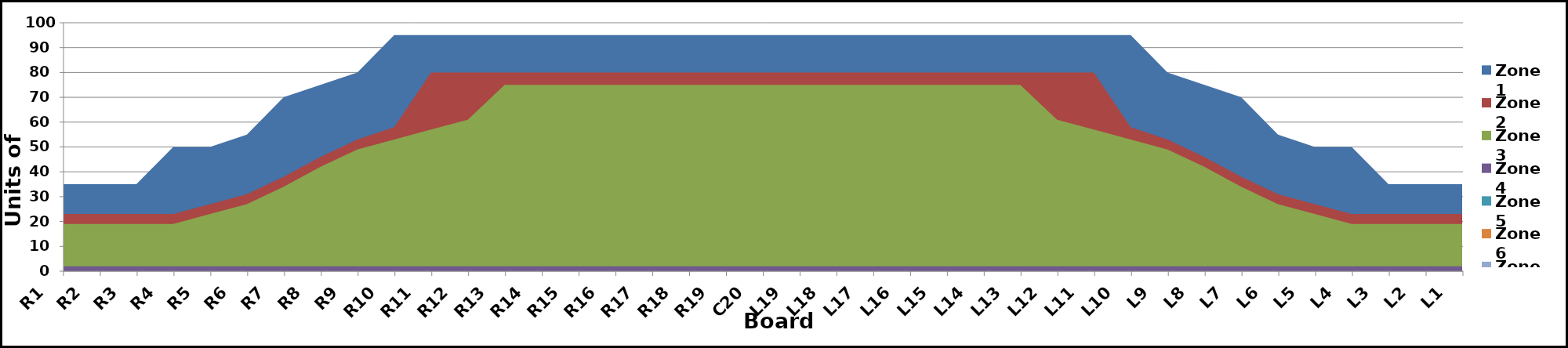
| Category | Zone 1 | Zone 2 | Zone 3 | Zone 4 | Zone 5 | Zone 6 | Zone 7 | Zone 8 |
|---|---|---|---|---|---|---|---|---|
| L1 | 35 | 23 | 19 | 2 | 0 |  |  |  |
| L2 | 35 | 23 | 19 | 2 | 0 |  |  |  |
| L3 | 35 | 23 | 19 | 2 | 0 |  |  |  |
| L4 | 50 | 23 | 19 | 2 | 0 |  |  |  |
| L5 | 50 | 27 | 23 | 2 | 0 |  |  |  |
| L6 | 55 | 31 | 27 | 2 | 0 |  |  |  |
| L7 | 70 | 38 | 34 | 2 | 0 |  |  |  |
| L8 | 75 | 46 | 42 | 2 | 0 |  |  |  |
| L9 | 80 | 53 | 49 | 2 | 0 |  |  |  |
| L10 | 95 | 58 | 53 | 2 | 0 |  |  |  |
| L11 | 95 | 80 | 57 | 2 | 0 |  |  |  |
| L12 | 95 | 80 | 61 | 2 | 0 |  |  |  |
| L13 | 95 | 80 | 75 | 2 | 0 |  |  |  |
| L14 | 95 | 80 | 75 | 2 | 0 |  |  |  |
| L15 | 95 | 80 | 75 | 2 | 0 |  |  |  |
| L16 | 95 | 80 | 75 | 2 | 0 |  |  |  |
| L17 | 95 | 80 | 75 | 2 | 0 |  |  |  |
| L18 | 95 | 80 | 75 | 2 | 0 |  |  |  |
| L19 | 95 | 80 | 75 | 2 | 0 |  |  |  |
| C20 | 95 | 80 | 75 | 2 | 0 |  |  |  |
| R19 | 95 | 80 | 75 | 2 | 0 |  |  |  |
| R18 | 95 | 80 | 75 | 2 | 0 |  |  |  |
| R17 | 95 | 80 | 75 | 2 | 0 |  |  |  |
| R16 | 95 | 80 | 75 | 2 | 0 |  |  |  |
| R15 | 95 | 80 | 75 | 2 | 0 |  |  |  |
| R14 | 95 | 80 | 75 | 2 | 0 |  |  |  |
| R13 | 95 | 80 | 75 | 2 | 0 |  |  |  |
| R12 | 95 | 80 | 61 | 2 | 0 |  |  |  |
| R11 | 95 | 80 | 57 | 2 | 0 |  |  |  |
| R10 | 95 | 58 | 53 | 2 | 0 |  |  |  |
| R9 | 80 | 53 | 49 | 2 | 0 |  |  |  |
| R8 | 75 | 46 | 42 | 2 | 0 |  |  |  |
| R7 | 70 | 38 | 34 | 2 | 0 |  |  |  |
| R6 | 55 | 31 | 27 | 2 | 0 |  |  |  |
| R5 | 50 | 27 | 23 | 2 | 0 |  |  |  |
| R4 | 50 | 23 | 19 | 2 | 0 |  |  |  |
| R3 | 35 | 23 | 19 | 2 | 0 |  |  |  |
| R2 | 35 | 23 | 19 | 2 | 0 |  |  |  |
| R1 | 35 | 23 | 19 | 2 | 0 |  |  |  |